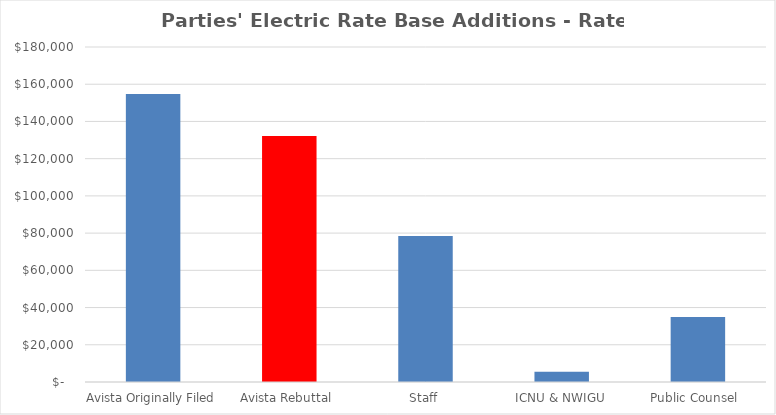
| Category | Rate Year 1 |
|---|---|
| Avista Originally Filed  | 154785 |
| Avista Rebuttal  | 132235 |
| Staff | 78391 |
| ICNU & NWIGU | 5565 |
| Public Counsel  | 34911 |